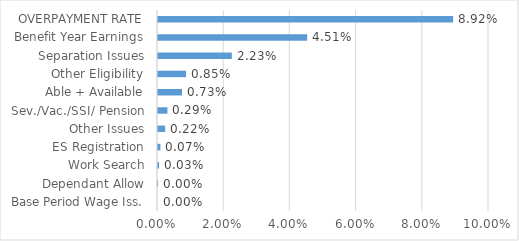
| Category | Series 0 |
|---|---|
| Base Period Wage Iss. | 0 |
| Dependant Allow | 0 |
| Work Search | 0 |
| ES Registration | 0.001 |
| Other Issues | 0.002 |
| Sev./Vac./SSI/ Pension | 0.003 |
| Able + Available | 0.007 |
| Other Eligibility | 0.008 |
| Separation Issues | 0.022 |
| Benefit Year Earnings | 0.045 |
| OVERPAYMENT RATE | 0.089 |